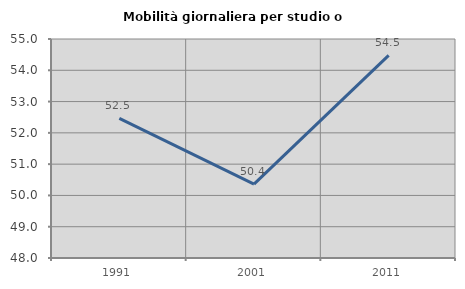
| Category | Mobilità giornaliera per studio o lavoro |
|---|---|
| 1991.0 | 52.463 |
| 2001.0 | 50.359 |
| 2011.0 | 54.476 |